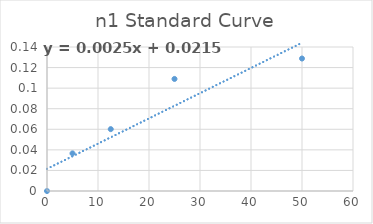
| Category | Series 0 |
|---|---|
| 50.0 | 0.129 |
| 25.0 | 0.109 |
| 12.5 | 0.06 |
| 5.0 | 0.037 |
| 0.0 | 0 |